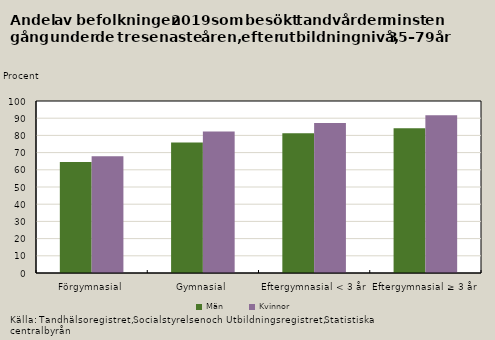
| Category | Män | Kvinnor |
|---|---|---|
| Förgymnasial | 64.6 | 67.9 |
| Gymnasial | 75.9 | 82.2 |
| Eftergymnasial < 3 år | 81.3 | 87.2 |
| Eftergymnasial ≥ 3 år | 84.2 | 91.7 |